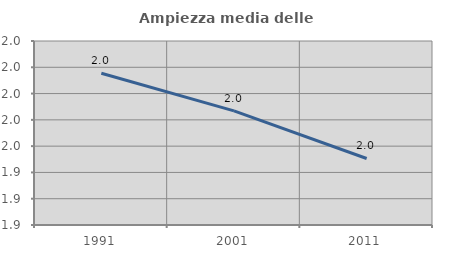
| Category | Ampiezza media delle famiglie |
|---|---|
| 1991.0 | 2.015 |
| 2001.0 | 1.987 |
| 2011.0 | 1.951 |